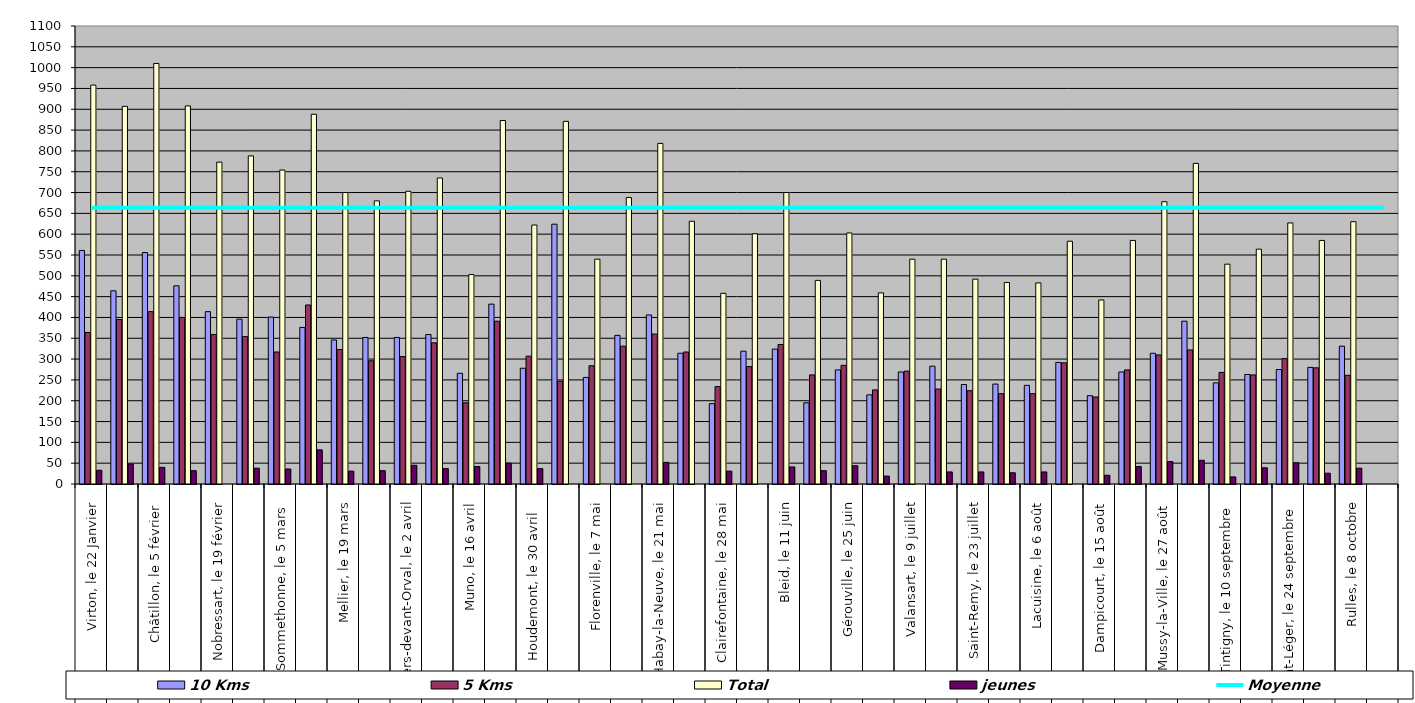
| Category | 10 Kms | 5 Kms | Total | jeunes |
|---|---|---|---|---|
| 0 | 561 | 364 | 958 | 33 |
| 1 | 464 | 395 | 907 | 48 |
| 2 | 556 | 414 | 1010 | 40 |
| 3 | 476 | 400 | 908 | 32 |
| 4 | 414 | 359 | 773 | 0 |
| 5 | 396 | 354 | 788 | 38 |
| 6 | 401 | 317 | 754 | 36 |
| 7 | 376 | 430 | 888 | 82 |
| 8 | 346 | 323 | 700 | 31 |
| 9 | 352 | 296 | 680 | 32 |
| 10 | 352 | 306 | 703 | 45 |
| 11 | 359 | 339 | 735 | 37 |
| 12 | 266 | 195 | 503 | 42 |
| 13 | 432 | 391 | 873 | 50 |
| 14 | 278 | 307 | 622 | 37 |
| 15 | 624 | 247 | 871 | 0 |
| 16 | 256 | 284 | 540 | 0 |
| 17 | 357 | 331 | 688 | 0 |
| 18 | 406 | 360 | 818 | 52 |
| 19 | 314 | 317 | 631 | 0 |
| 20 | 193 | 234 | 458 | 31 |
| 21 | 319 | 282 | 601 | 0 |
| 22 | 324 | 335 | 700 | 41 |
| 23 | 195 | 262 | 489 | 32 |
| 24 | 274 | 285 | 603 | 44 |
| 25 | 214 | 226 | 459 | 19 |
| 26 | 269 | 271 | 540 | 0 |
| 27 | 283 | 228 | 540 | 29 |
| 28 | 239 | 224 | 492 | 29 |
| 29 | 240 | 217 | 484 | 27 |
| 30 | 237 | 217 | 483 | 29 |
| 31 | 292 | 291 | 583 | 0 |
| 32 | 212 | 209 | 442 | 21 |
| 33 | 269 | 274 | 585 | 42 |
| 34 | 314 | 310 | 678 | 54 |
| 35 | 391 | 322 | 770 | 57 |
| 36 | 243 | 268 | 528 | 17 |
| 37 | 263 | 262 | 564 | 39 |
| 38 | 275 | 301 | 627 | 51 |
| 39 | 280 | 279 | 585 | 26 |
| 40 | 331 | 261 | 630 | 38 |
| 41 | 0 | 0 | 0 | 0 |